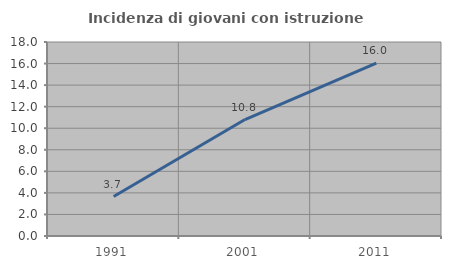
| Category | Incidenza di giovani con istruzione universitaria |
|---|---|
| 1991.0 | 3.659 |
| 2001.0 | 10.803 |
| 2011.0 | 16.041 |